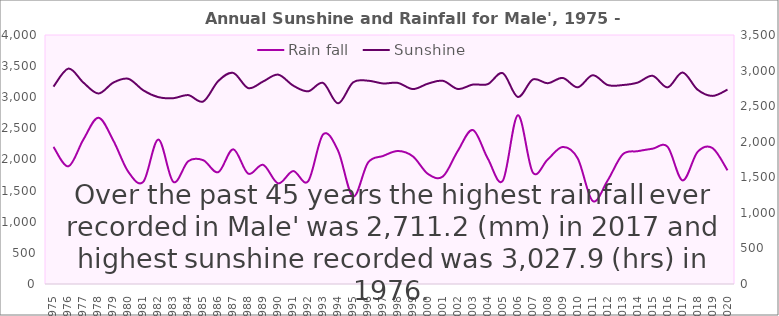
| Category | Rain fall |
|---|---|
| 1975.0 | 2202 |
| 1976.0 | 1890.4 |
| 1977.0 | 2322.5 |
| 1978.0 | 2670.4 |
| 1979.0 | 2301.9 |
| 1980.0 | 1800.4 |
| 1981.0 | 1642.9 |
| 1982.0 | 2320.5 |
| 1983.0 | 1640.3 |
| 1984.0 | 1973.3 |
| 1985.0 | 1988.7 |
| 1986.0 | 1795.9 |
| 1987.0 | 2163.5 |
| 1988.0 | 1772.4 |
| 1989.0 | 1913.8 |
| 1990.0 | 1616.8 |
| 1991.0 | 1814.1 |
| 1992.0 | 1650 |
| 1993.0 | 2402.8 |
| 1994.0 | 2141.1 |
| 1995.0 | 1407 |
| 1996.0 | 1950.5 |
| 1997.0 | 2056.3 |
| 1998.0 | 2136.8 |
| 1999.0 | 2049.2 |
| 2000.0 | 1767.9 |
| 2001.0 | 1727.5 |
| 2002.0 | 2140.5 |
| 2003.0 | 2473.4 |
| 2004.0 | 2013.5 |
| 2005.0 | 1659.2 |
| 2006.0 | 2711.2 |
| 2007.0 | 1792.1 |
| 2008.0 | 2001.8 |
| 2009.0 | 2201.5 |
| 2010.0 | 2017.9 |
| 2011.0 | 1333.3 |
| 2012.0 | 1664.1 |
| 2013.0 | 2081.8 |
| 2014.0 | 2133.5 |
| 2015.0 | 2173.6 |
| 2016.0 | 2204.7 |
| 2017.0 | 1664.4 |
| 2018.0 | 2121.1 |
| 2019.0 | 2183.4 |
| 2020.0 | 1826.3 |